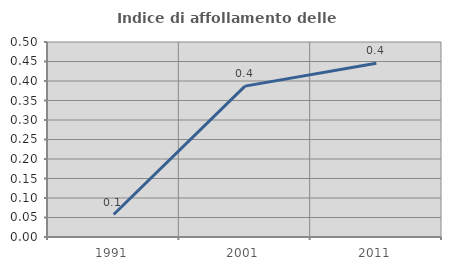
| Category | Indice di affollamento delle abitazioni  |
|---|---|
| 1991.0 | 0.058 |
| 2001.0 | 0.387 |
| 2011.0 | 0.446 |